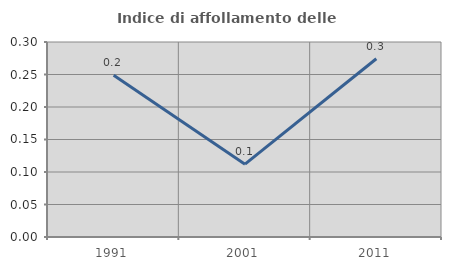
| Category | Indice di affollamento delle abitazioni  |
|---|---|
| 1991.0 | 0.249 |
| 2001.0 | 0.112 |
| 2011.0 | 0.274 |